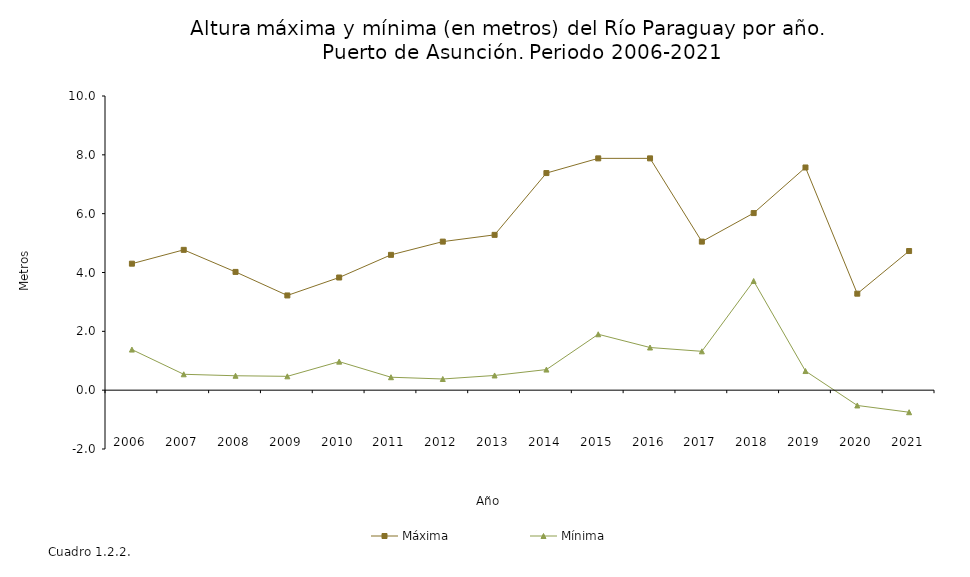
| Category | Máxima |
|---|---|
| 2006.0 | 4.3 |
| 2007.0 | 4.77 |
| 2008.0 | 4.02 |
| 2009.0 | 3.22 |
| 2010.0 | 3.83 |
| 2011.0 | 4.6 |
| 2012.0 | 5.05 |
| 2013.0 | 5.28 |
| 2014.0 | 7.38 |
| 2015.0 | 7.88 |
| 2016.0 | 7.88 |
| 2017.0 | 5.05 |
| 2018.0 | 6.02 |
| 2019.0 | 7.57 |
| 2020.0 | 3.28 |
| 2021.0 | 4.73 |